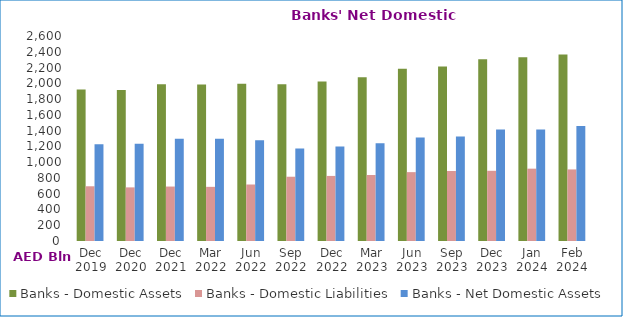
| Category | Banks - Domestic Assets | Banks - Domestic Liabilities | Banks - Net Domestic Assets |
|---|---|---|---|
| Dec 2019 | 1921858 | 694163 | 1227695 |
| Dec 2020 | 1914006 | 680050 | 1233956 |
| Dec 2021 | 1986536 | 690705 | 1295831 |
| Mar 2022 | 1985130 | 686853 | 1298277 |
| Jun 2022 | 1995659 | 716511 | 1279148 |
| Sep 2022 | 1989204 | 815106 | 1174098 |
| Dec 2022 | 2024244 | 825376 | 1198868 |
| Mar 2023 | 2075687 | 837072 | 1238615 |
| Jun 2023 | 2185092 | 873424 | 1311668 |
| Sep 2023 | 2213183 | 887928 | 1325255 |
| Dec 2023 | 2303792 | 890363 | 1413429 |
| Jan 2024 | 2330530 | 917411 | 1413119 |
| Feb 2024 | 2364729 | 907741 | 1456988 |